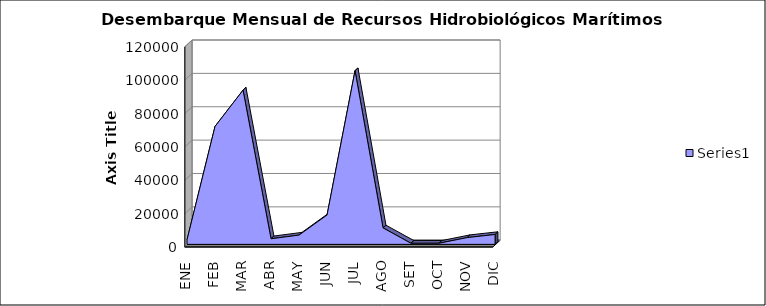
| Category | Series 12 |
|---|---|
| ENE | 2744.19 |
| FEB | 70707.75 |
| MAR | 92427.7 |
| ABR | 3346.35 |
| MAY | 5549.04 |
| JUN | 17601.68 |
| JUL | 104076.86 |
| AGO | 9875.18 |
| SET | 616.98 |
| OCT | 662.77 |
| NOV | 4042.69 |
| DIC | 5899.72 |